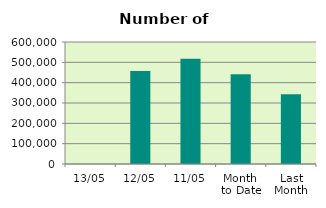
| Category | Series 0 |
|---|---|
| 13/05 | 0 |
| 12/05 | 456878 |
| 11/05 | 517266 |
| Month 
to Date | 440886.75 |
| Last
Month | 343067.2 |